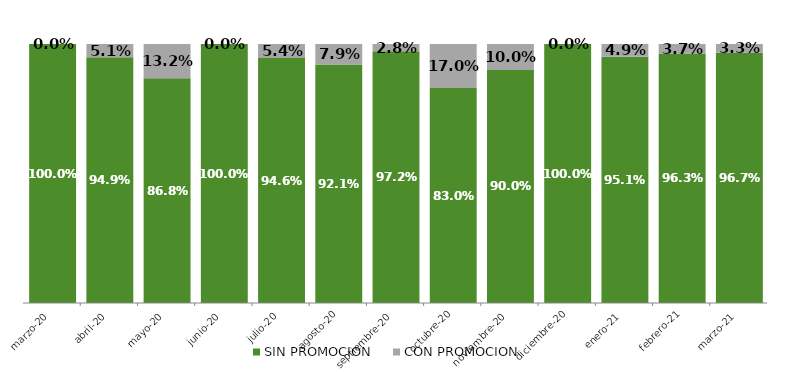
| Category | SIN PROMOCION   | CON PROMOCION   |
|---|---|---|
| 2020-03-01 | 1 | 0 |
| 2020-04-01 | 0.949 | 0.051 |
| 2020-05-01 | 0.868 | 0.132 |
| 2020-06-01 | 1 | 0 |
| 2020-07-01 | 0.946 | 0.054 |
| 2020-08-01 | 0.921 | 0.079 |
| 2020-09-01 | 0.972 | 0.028 |
| 2020-10-01 | 0.83 | 0.17 |
| 2020-11-01 | 0.9 | 0.1 |
| 2020-12-01 | 1 | 0 |
| 2021-01-01 | 0.951 | 0.049 |
| 2021-02-01 | 0.963 | 0.037 |
| 2021-03-01 | 0.967 | 0.033 |